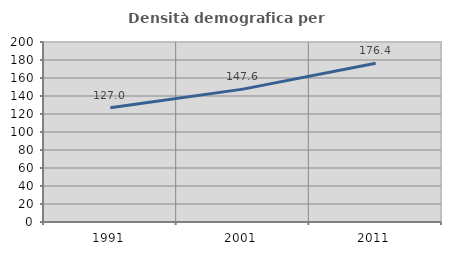
| Category | Densità demografica |
|---|---|
| 1991.0 | 127.01 |
| 2001.0 | 147.647 |
| 2011.0 | 176.368 |